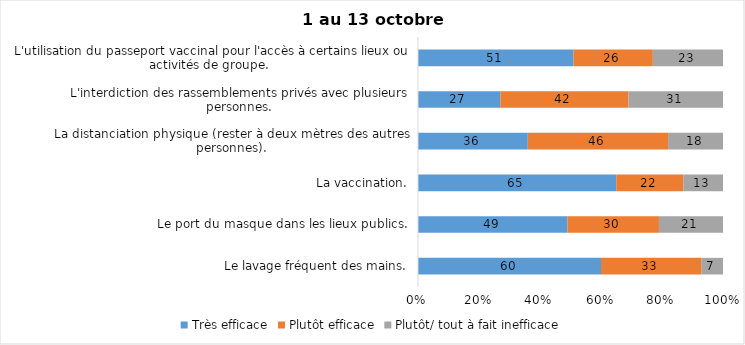
| Category | Très efficace | Plutôt efficace | Plutôt/ tout à fait inefficace |
|---|---|---|---|
| Le lavage fréquent des mains. | 60 | 33 | 7 |
| Le port du masque dans les lieux publics. | 49 | 30 | 21 |
| La vaccination. | 65 | 22 | 13 |
| La distanciation physique (rester à deux mètres des autres personnes). | 36 | 46 | 18 |
| L'interdiction des rassemblements privés avec plusieurs personnes. | 27 | 42 | 31 |
| L'utilisation du passeport vaccinal pour l'accès à certains lieux ou activités de groupe.  | 51 | 26 | 23 |